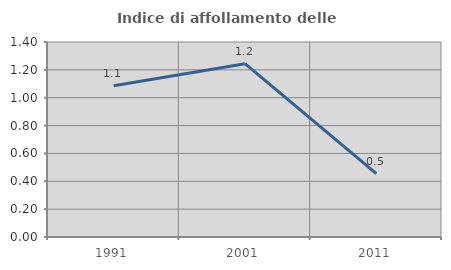
| Category | Indice di affollamento delle abitazioni  |
|---|---|
| 1991.0 | 1.085 |
| 2001.0 | 1.244 |
| 2011.0 | 0.455 |